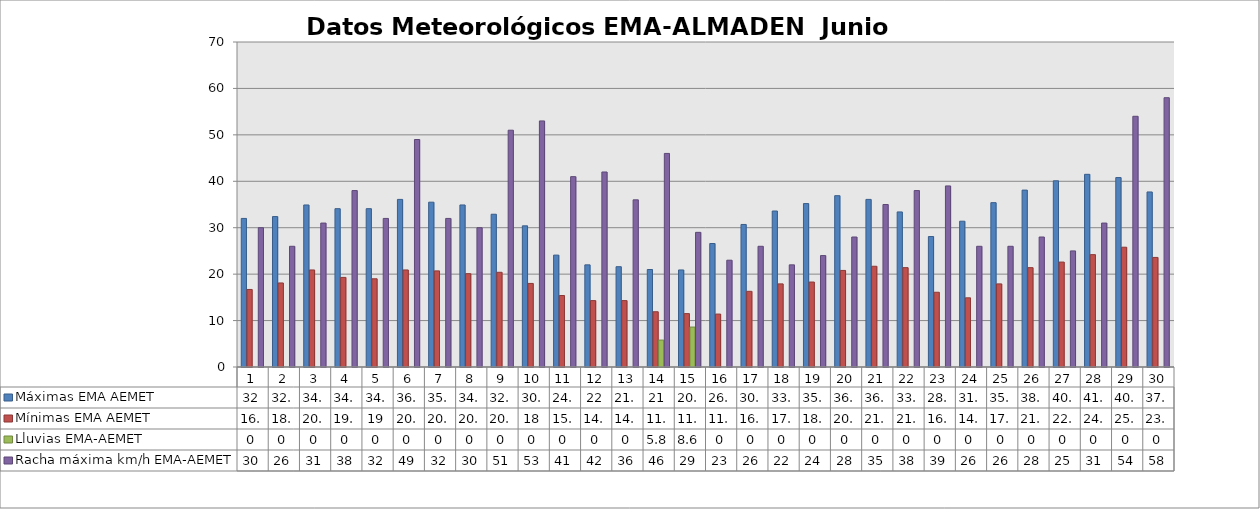
| Category | Máximas EMA AEMET | Mínimas EMA AEMET | Lluvias EMA-AEMET | Racha máxima km/h EMA-AEMET |
|---|---|---|---|---|
| 0 | 32 | 16.7 | 0 | 30 |
| 1 | 32.4 | 18.1 | 0 | 26 |
| 2 | 34.9 | 20.9 | 0 | 31 |
| 3 | 34.1 | 19.3 | 0 | 38 |
| 4 | 34.1 | 19 | 0 | 32 |
| 5 | 36.1 | 20.9 | 0 | 49 |
| 6 | 35.5 | 20.7 | 0 | 32 |
| 7 | 34.9 | 20.1 | 0 | 30 |
| 8 | 32.9 | 20.4 | 0 | 51 |
| 9 | 30.4 | 18 | 0 | 53 |
| 10 | 24.1 | 15.4 | 0 | 41 |
| 11 | 22 | 14.3 | 0 | 42 |
| 12 | 21.6 | 14.3 | 0 | 36 |
| 13 | 21 | 11.9 | 5.8 | 46 |
| 14 | 20.9 | 11.5 | 8.6 | 29 |
| 15 | 26.6 | 11.4 | 0 | 23 |
| 16 | 30.7 | 16.3 | 0 | 26 |
| 17 | 33.6 | 17.9 | 0 | 22 |
| 18 | 35.2 | 18.3 | 0 | 24 |
| 19 | 36.9 | 20.8 | 0 | 28 |
| 20 | 36.1 | 21.7 | 0 | 35 |
| 21 | 33.4 | 21.4 | 0 | 38 |
| 22 | 28.1 | 16.1 | 0 | 39 |
| 23 | 31.4 | 14.9 | 0 | 26 |
| 24 | 35.4 | 17.9 | 0 | 26 |
| 25 | 38.1 | 21.4 | 0 | 28 |
| 26 | 40.1 | 22.6 | 0 | 25 |
| 27 | 41.5 | 24.2 | 0 | 31 |
| 28 | 40.8 | 25.8 | 0 | 54 |
| 29 | 37.7 | 23.6 | 0 | 58 |